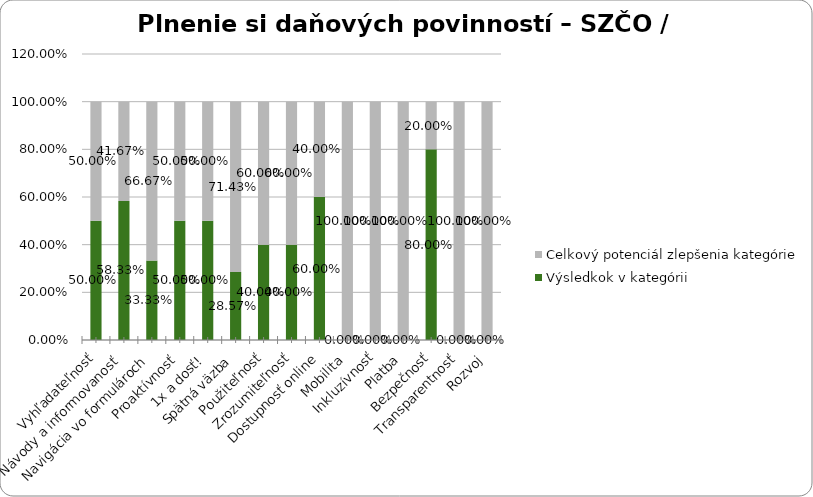
| Category | Výsledkok v kategórii | Celkový potenciál zlepšenia kategórie |
|---|---|---|
| Vyhľadateľnosť | 0.5 | 0.5 |
| Návody a informovanosť | 0.583 | 0.417 |
| Navigácia vo formulároch | 0.333 | 0.667 |
| Proaktívnosť | 0.5 | 0.5 |
| 1x a dosť! | 0.5 | 0.5 |
| Spätná väzba | 0.286 | 0.714 |
| Použiteľnosť | 0.4 | 0.6 |
| Zrozumiteľnosť | 0.4 | 0.6 |
| Dostupnosť online | 0.6 | 0.4 |
| Mobilita | 0 | 1 |
| Inkluzívnosť | 0 | 1 |
| Platba | 0 | 1 |
| Bezpečnosť | 0.8 | 0.2 |
| Transparentnosť | 0 | 1 |
| Rozvoj | 0 | 1 |